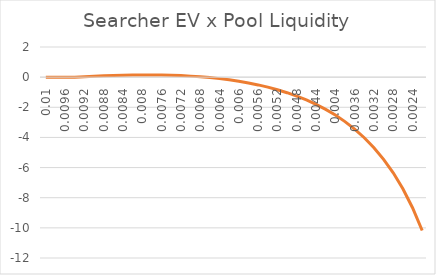
| Category | (dRate/dVlm) |
|---|---|
| 0.01 | 0 |
| 0.0098 | 0 |
| 0.0096 | 0 |
| 0.009399999999999999 | 0 |
| 0.009199999999999998 | 0.023 |
| 0.008999999999999998 | 0.057 |
| 0.008799999999999997 | 0.087 |
| 0.008599999999999997 | 0.111 |
| 0.008399999999999996 | 0.13 |
| 0.008199999999999995 | 0.143 |
| 0.007999999999999995 | 0.149 |
| 0.007799999999999995 | 0.149 |
| 0.007599999999999996 | 0.141 |
| 0.007399999999999996 | 0.126 |
| 0.007199999999999996 | 0.101 |
| 0.006999999999999997 | 0.067 |
| 0.006799999999999997 | 0.024 |
| 0.006599999999999997 | -0.032 |
| 0.006399999999999998 | -0.099 |
| 0.006199999999999998 | -0.179 |
| 0.005999999999999998 | -0.275 |
| 0.005799999999999999 | -0.386 |
| 0.005599999999999999 | -0.515 |
| 0.005399999999999999 | -0.665 |
| 0.0052 | -0.836 |
| 0.005 | -1.032 |
| 0.0048000000000000004 | -1.256 |
| 0.004600000000000001 | -1.512 |
| 0.004400000000000001 | -1.804 |
| 0.0042000000000000015 | -2.136 |
| 0.004000000000000002 | -2.516 |
| 0.0038000000000000017 | -2.95 |
| 0.0036000000000000016 | -3.448 |
| 0.0034000000000000015 | -4.021 |
| 0.0032000000000000015 | -4.683 |
| 0.0030000000000000014 | -5.452 |
| 0.0028000000000000013 | -6.35 |
| 0.002600000000000001 | -7.407 |
| 0.002400000000000001 | -8.664 |
| 0.002200000000000001 | -10.175 |